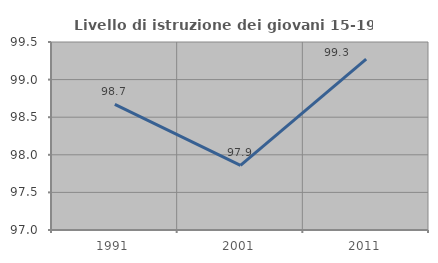
| Category | Livello di istruzione dei giovani 15-19 anni |
|---|---|
| 1991.0 | 98.67 |
| 2001.0 | 97.859 |
| 2011.0 | 99.273 |